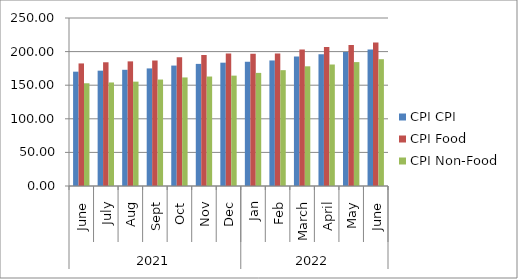
| Category | CPI CPI | CPI Food | CPI Non-Food |
|---|---|---|---|
| 0 | 170.133 | 182.392 | 152.881 |
| 1 | 171.63 | 184.121 | 154.053 |
| 2 | 172.922 | 185.454 | 155.287 |
| 3 | 174.974 | 186.742 | 158.414 |
| 4 | 179.205 | 191.755 | 161.543 |
| 5 | 181.722 | 195.096 | 162.9 |
| 6 | 183.513 | 197.209 | 164.24 |
| 7 | 184.886 | 196.659 | 168.316 |
| 8 | 186.822 | 197.094 | 172.366 |
| 9 | 192.711 | 203.087 | 178.111 |
| 10 | 196.01 | 206.824 | 180.79 |
| 11 | 199.307 | 209.92 | 184.373 |
| 12 | 203.178 | 213.476 | 188.685 |